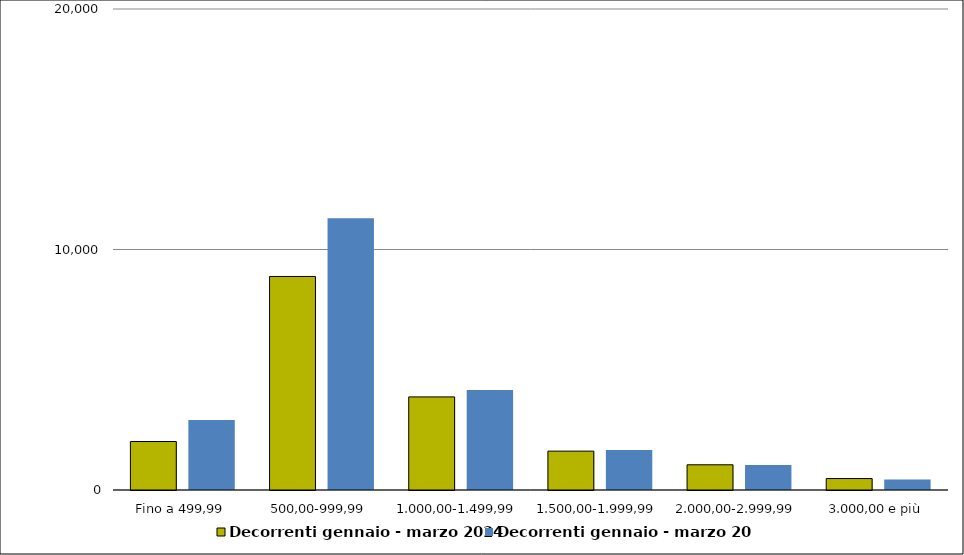
| Category | Decorrenti gennaio - marzo 2024 | Decorrenti gennaio - marzo 2023 |
|---|---|---|
|  Fino a 499,99  | 2016 | 2909 |
|  500,00-999,99  | 8879 | 11300 |
|  1.000,00-1.499,99  | 3871 | 4153 |
|  1.500,00-1.999,99  | 1616 | 1666 |
|  2.000,00-2.999,99  | 1048 | 1038 |
|  3.000,00 e più  | 476 | 438 |